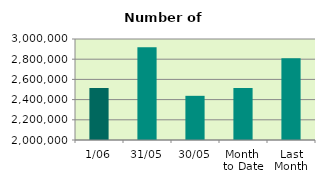
| Category | Series 0 |
|---|---|
| 1/06 | 2513950 |
| 31/05 | 2918778 |
| 30/05 | 2437418 |
| Month 
to Date | 2513950 |
| Last
Month | 2808947.182 |